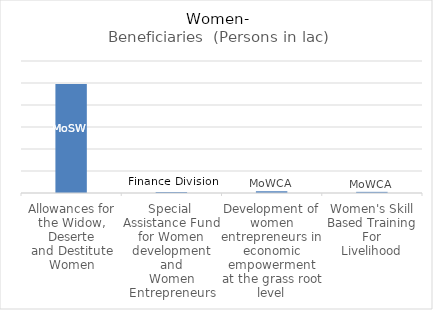
| Category | Beneficiaries  (Persons in lac) |
|---|---|
| Allowances for the Widow, Deserte
and Destitute Women | 24.75 |
| Special  Assistance Fund for Women development and
Women Entrepreneurs | 0.25 |
| Development of women entrepreneurs in economic empowerment at the grass root
level | 0.4 |
| Women's Skill Based Training For
Livelihood | 0.26 |